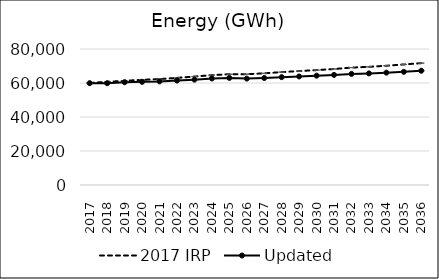
| Category | 2017 IRP | Updated |
|---|---|---|
| 2017.0 | 60061.416 | 59901.75 |
| 2018.0 | 60670.449 | 59876.34 |
| 2019.0 | 61301.356 | 60448.53 |
| 2020.0 | 61863.305 | 60684.39 |
| 2021.0 | 62297.194 | 60952.64 |
| 2022.0 | 63007.033 | 61451.78 |
| 2023.0 | 63799.742 | 61983.04 |
| 2024.0 | 64610.372 | 62662 |
| 2025.0 | 65171.551 | 63004.77 |
| 2026.0 | 65182.973 | 62578.26 |
| 2027.0 | 65683.651 | 62922.46 |
| 2028.0 | 66405.196 | 63445.05 |
| 2029.0 | 67030.958 | 63845.88 |
| 2030.0 | 67587.834 | 64322.31 |
| 2031.0 | 68227.278 | 64770.98 |
| 2032.0 | 69064.299 | 65354.9 |
| 2033.0 | 69512.841 | 65647.92 |
| 2034.0 | 70162.329 | 66096.09 |
| 2035.0 | 70904.558 | 66564.41 |
| 2036.0 | 71697.055 | 67214.07 |